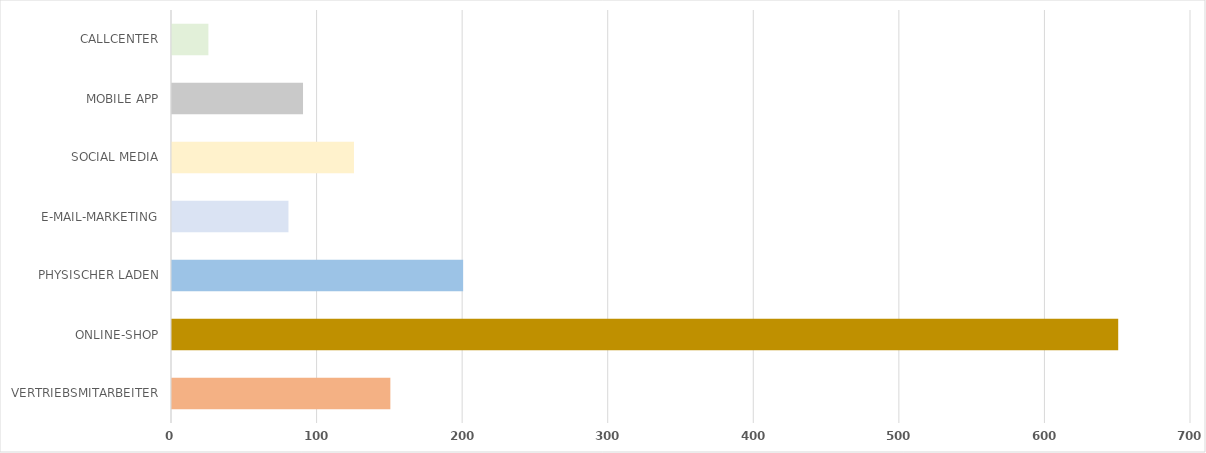
| Category | Series 0 |
|---|---|
| VERTRIEBSMITARBEITER | 150 |
| ONLINE-SHOP | 650 |
| PHYSISCHER LADEN | 200 |
| E-MAIL-MARKETING | 80 |
| SOCIAL MEDIA | 125 |
| MOBILE APP | 90 |
| CALLCENTER | 25 |